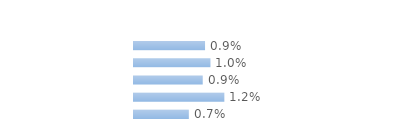
| Category | Series 0 |
|---|---|
| Communes rurales | 0.009 |
| moins de 20 000 hab. | 0.01 |
| 20 000 - 100 000 hab. | 0.009 |
| 100 000 hab. ou plus | 0.012 |
| Agglomération parisienne | 0.007 |